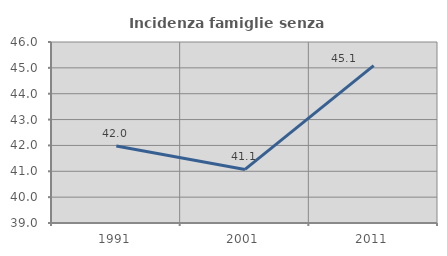
| Category | Incidenza famiglie senza nuclei |
|---|---|
| 1991.0 | 41.981 |
| 2001.0 | 41.071 |
| 2011.0 | 45.083 |